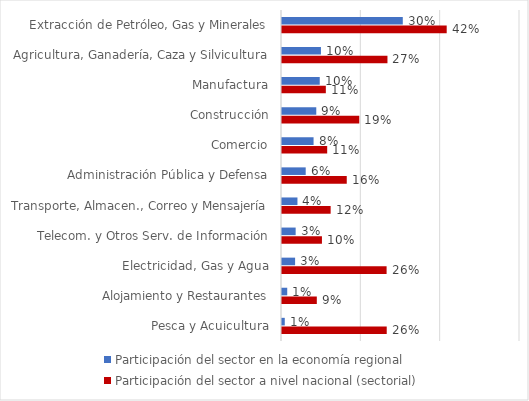
| Category | Participación del sector en la economía regional | Participación del sector a nivel nacional (sectorial) |
|---|---|---|
| Extracción de Petróleo, Gas y Minerales | 0.305 | 0.415 |
| Agricultura, Ganadería, Caza y Silvicultura | 0.098 | 0.266 |
| Manufactura | 0.095 | 0.111 |
| Construcción | 0.086 | 0.195 |
| Comercio | 0.08 | 0.114 |
| Administración Pública y Defensa | 0.06 | 0.163 |
| Transporte, Almacen., Correo y Mensajería | 0.039 | 0.123 |
| Telecom. y Otros Serv. de Información | 0.034 | 0.101 |
| Electricidad, Gas y Agua | 0.033 | 0.264 |
| Alojamiento y Restaurantes | 0.013 | 0.088 |
| Pesca y Acuicultura | 0.007 | 0.264 |